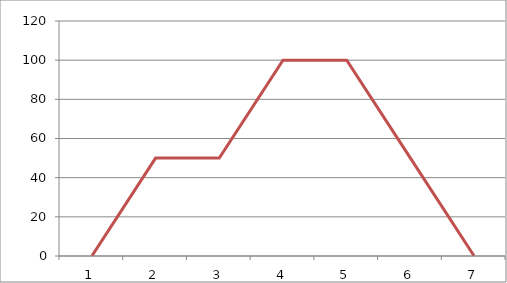
| Category | Series 1 |
|---|---|
| 0 | 0 |
| 1 | 50 |
| 2 | 50 |
| 3 | 100 |
| 4 | 100 |
| 5 | 50 |
| 6 | 0 |